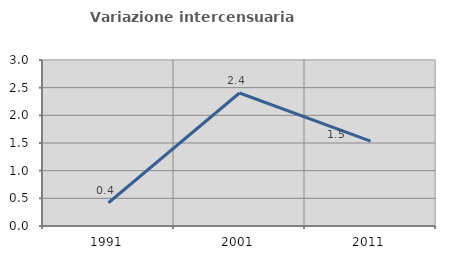
| Category | Variazione intercensuaria annua |
|---|---|
| 1991.0 | 0.42 |
| 2001.0 | 2.403 |
| 2011.0 | 1.533 |